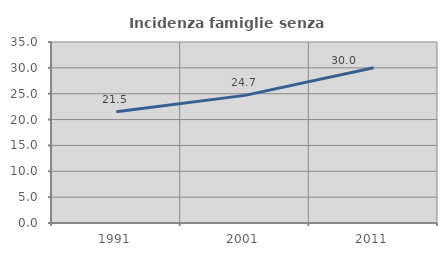
| Category | Incidenza famiglie senza nuclei |
|---|---|
| 1991.0 | 21.508 |
| 2001.0 | 24.678 |
| 2011.0 | 30.014 |